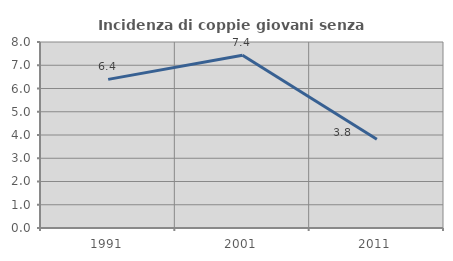
| Category | Incidenza di coppie giovani senza figli |
|---|---|
| 1991.0 | 6.393 |
| 2001.0 | 7.428 |
| 2011.0 | 3.817 |